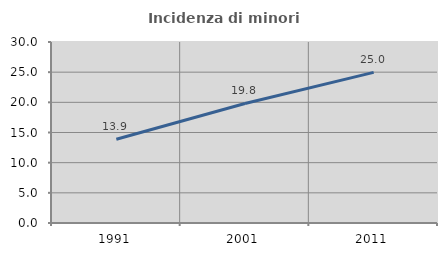
| Category | Incidenza di minori stranieri |
|---|---|
| 1991.0 | 13.889 |
| 2001.0 | 19.818 |
| 2011.0 | 24.962 |